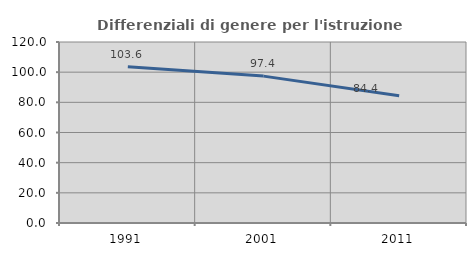
| Category | Differenziali di genere per l'istruzione superiore |
|---|---|
| 1991.0 | 103.552 |
| 2001.0 | 97.379 |
| 2011.0 | 84.393 |